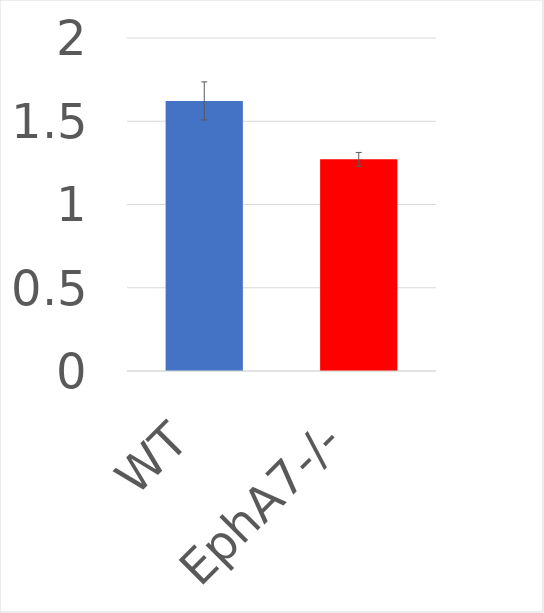
| Category | Series 0 |
|---|---|
| WT | 1.622 |
| EphA7-/- | 1.271 |